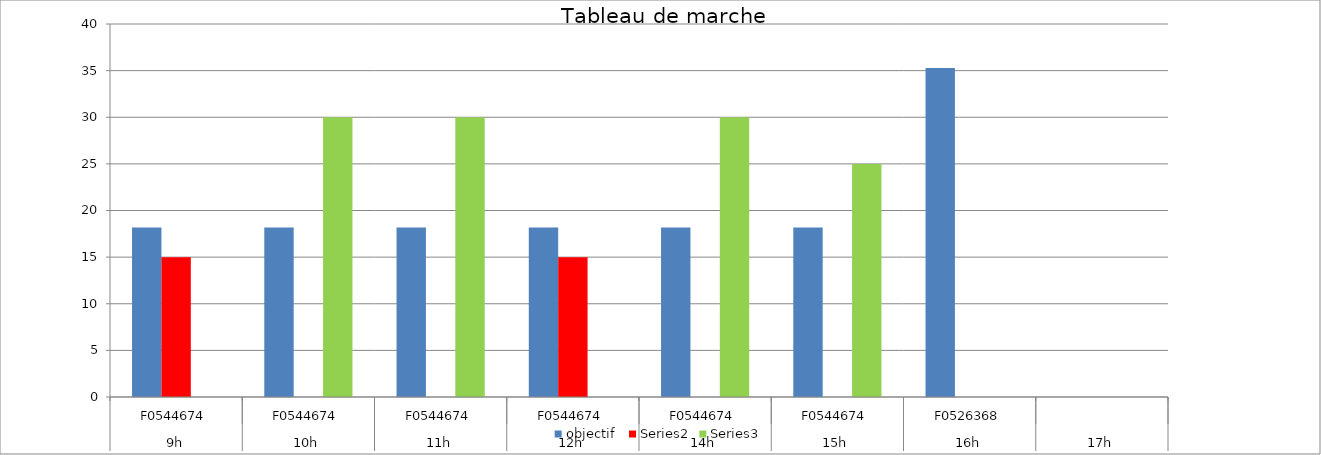
| Category | objectif  | Series 2 | Series 3 |
|---|---|---|---|
| 0 | 18.182 | 15 | 0 |
| 1 | 18.182 | 0 | 30 |
| 2 | 18.182 | 0 | 30 |
| 3 | 18.182 | 15 | 0 |
| 4 | 18.182 | 0 | 30 |
| 5 | 18.182 | 0 | 25 |
| 6 | 35.294 | 0 | 0 |
| 7 | 0 | 0 | 0 |